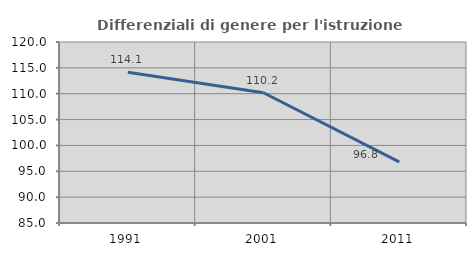
| Category | Differenziali di genere per l'istruzione superiore |
|---|---|
| 1991.0 | 114.135 |
| 2001.0 | 110.183 |
| 2011.0 | 96.834 |